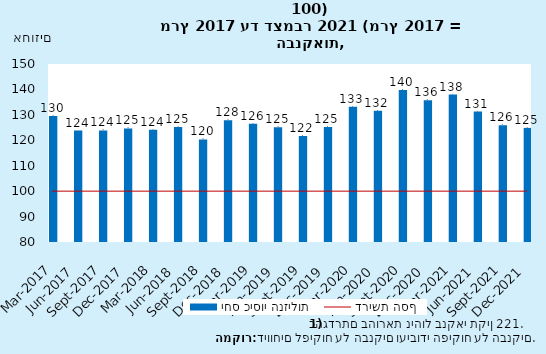
| Category | יחס כיסוי הנזילות |
|---|---|
| 2017-03-31 | 129.523 |
| 2017-06-30 | 123.841 |
| 2017-09-30 | 123.88 |
| 2017-12-31 | 124.656 |
| 2018-03-31 | 124.101 |
| 2018-06-30 | 125.26 |
| 2018-09-30 | 120.318 |
| 2018-12-31 | 127.832 |
| 2019-03-31 | 126.495 |
| 2019-06-30 | 125.095 |
| 2019-09-30 | 121.685 |
| 2019-12-31 | 125.254 |
| 2020-03-31 | 133.186 |
| 2020-06-30 | 131.572 |
| 2020-09-30 | 139.76 |
| 2020-12-31 | 135.736 |
| 2021-03-31 | 137.995 |
| 2021-06-30 | 131.312 |
| 2021-09-30 | 125.924 |
| 2021-12-31 | 124.864 |